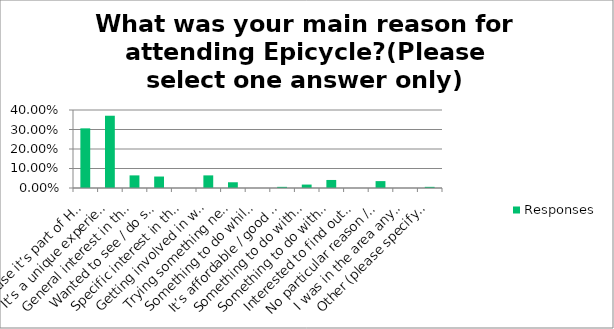
| Category | Responses |
|---|---|
| Because it’s part of Hull UK City of Culture 2017 | 0.306 |
| It’s a unique experience not to be missed | 0.371 |
| General interest in this type of event | 0.065 |
| Wanted to see / do something creative | 0.059 |
| Specific interest in the actors / artists involved (please specify which artists below) | 0 |
| Getting involved in what’s happening | 0.065 |
| Trying something new or different | 0.029 |
| Something to do while I’m in Hull on business | 0 |
| It’s affordable / good value | 0.006 |
| Something to do with friends / family | 0.018 |
| Something to do with the kids | 0.041 |
| Interested to find out more about Hull | 0 |
| No particular reason / someone else’s idea | 0.035 |
| I was in the area anyway | 0 |
| Other (please specify below) | 0.006 |